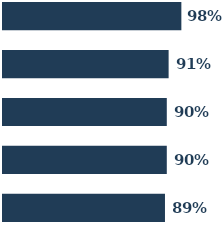
| Category | Series 0 | Series 1 | Series 2 | Series 3 | Series 4 |
|---|---|---|---|---|---|
| 0 | 0.98 | 0.91 | 0.9 | 0.9 | 0.89 |